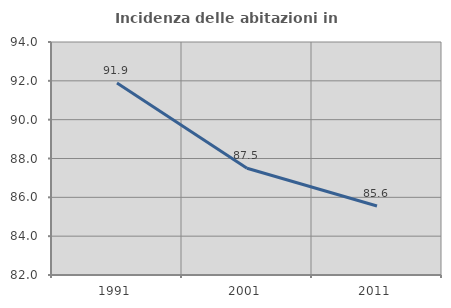
| Category | Incidenza delle abitazioni in proprietà  |
|---|---|
| 1991.0 | 91.892 |
| 2001.0 | 87.5 |
| 2011.0 | 85.556 |